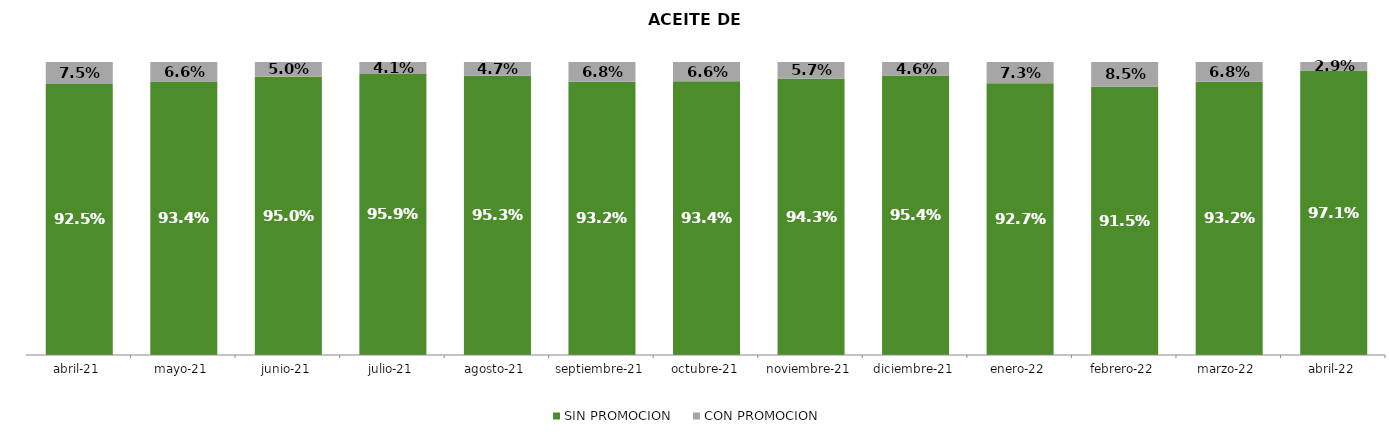
| Category | SIN PROMOCION   | CON PROMOCION   |
|---|---|---|
| 2021-04-01 | 0.925 | 0.075 |
| 2021-05-01 | 0.934 | 0.066 |
| 2021-06-01 | 0.95 | 0.05 |
| 2021-07-01 | 0.959 | 0.041 |
| 2021-08-01 | 0.953 | 0.047 |
| 2021-09-01 | 0.932 | 0.068 |
| 2021-10-01 | 0.934 | 0.066 |
| 2021-11-01 | 0.943 | 0.057 |
| 2021-12-01 | 0.954 | 0.046 |
| 2022-01-01 | 0.927 | 0.073 |
| 2022-02-01 | 0.915 | 0.085 |
| 2022-03-01 | 0.932 | 0.068 |
| 2022-04-01 | 0.971 | 0.029 |